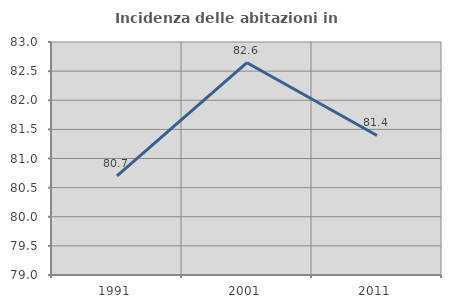
| Category | Incidenza delle abitazioni in proprietà  |
|---|---|
| 1991.0 | 80.702 |
| 2001.0 | 82.645 |
| 2011.0 | 81.395 |